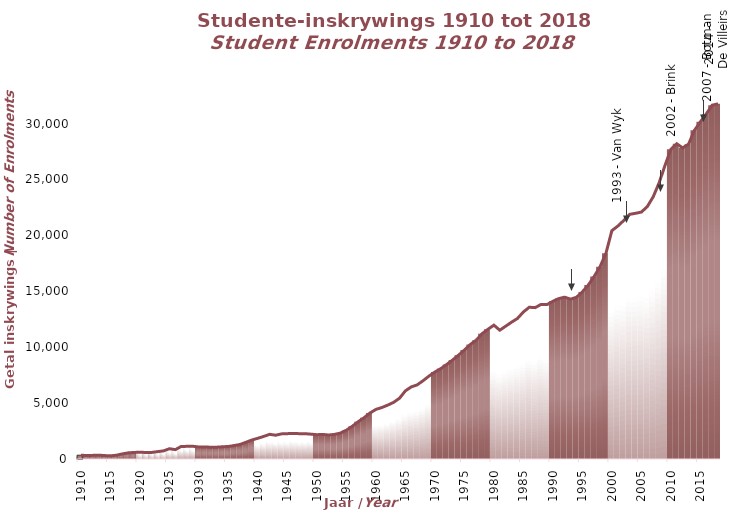
| Category | Studente |
|---|---|
| 1910.0 | 340 |
| 1911.0 | 304 |
| 1912.0 | 324 |
| 1913.0 | 341 |
| 1914.0 | 307 |
| 1915.0 | 280 |
| 1916.0 | 337 |
| 1917.0 | 453 |
| 1918.0 | 548 |
| 1919.0 | 587 |
| 1920.0 | 606 |
| 1921.0 | 583 |
| 1922.0 | 588 |
| 1923.0 | 660 |
| 1924.0 | 726 |
| 1925.0 | 919 |
| 1926.0 | 838 |
| 1927.0 | 1123 |
| 1928.0 | 1131 |
| 1929.0 | 1137 |
| 1930.0 | 1074 |
| 1931.0 | 1084 |
| 1932.0 | 1050 |
| 1933.0 | 1057 |
| 1934.0 | 1094 |
| 1935.0 | 1121 |
| 1936.0 | 1206 |
| 1937.0 | 1303 |
| 1938.0 | 1500 |
| 1939.0 | 1703 |
| 1940.0 | 1856 |
| 1941.0 | 2023 |
| 1942.0 | 2207 |
| 1943.0 | 2127 |
| 1944.0 | 2246 |
| 1945.0 | 2268 |
| 1946.0 | 2281 |
| 1947.0 | 2267 |
| 1948.0 | 2263 |
| 1949.0 | 2221 |
| 1950.0 | 2175 |
| 1951.0 | 2196 |
| 1952.0 | 2147 |
| 1953.0 | 2201 |
| 1954.0 | 2319 |
| 1955.0 | 2578 |
| 1956.0 | 2928 |
| 1957.0 | 3335 |
| 1958.0 | 3694 |
| 1959.0 | 4117 |
| 1960.0 | 4435 |
| 1961.0 | 4602 |
| 1962.0 | 4818 |
| 1963.0 | 5065 |
| 1964.0 | 5436 |
| 1965.0 | 6096 |
| 1966.0 | 6449 |
| 1967.0 | 6631 |
| 1968.0 | 7002 |
| 1969.0 | 7416 |
| 1970.0 | 7778 |
| 1971.0 | 8082 |
| 1972.0 | 8451 |
| 1973.0 | 8850 |
| 1974.0 | 9284 |
| 1975.0 | 9742 |
| 1976.0 | 10238 |
| 1977.0 | 10623 |
| 1978.0 | 11207 |
| 1979.0 | 11604 |
| 1980.0 | 11969 |
| 1981.0 | 11519 |
| 1982.0 | 11878 |
| 1983.0 | 12237 |
| 1984.0 | 12571 |
| 1985.0 | 13149 |
| 1986.0 | 13573 |
| 1987.0 | 13536 |
| 1988.0 | 13827 |
| 1989.0 | 13807 |
| 1990.0 | 14104 |
| 1991.0 | 14347 |
| 1992.0 | 14473 |
| 1993.0 | 14298 |
| 1994.0 | 14462 |
| 1995.0 | 14946 |
| 1996.0 | 15555 |
| 1997.0 | 16327 |
| 1998.0 | 17200 |
| 1999.0 | 18404 |
| 2000.0 | 20421 |
| 2001.0 | 20828 |
| 2002.0 | 21324 |
| 2003.0 | 21879 |
| 2004.0 | 21972 |
| 2005.0 | 22082 |
| 2006.0 | 22569 |
| 2007.0 | 23439 |
| 2008.0 | 24686 |
| 2009.0 | 26243 |
| 2010.0 | 27694 |
| 2011.0 | 28193 |
| 2012.0 | 27823 |
| 2013.0 | 28156 |
| 2014.0 | 29393 |
| 2015.0 | 30150 |
| 2016.0 | 30854 |
| 2017.0 | 31639 |
| 2018.0 | 31765 |